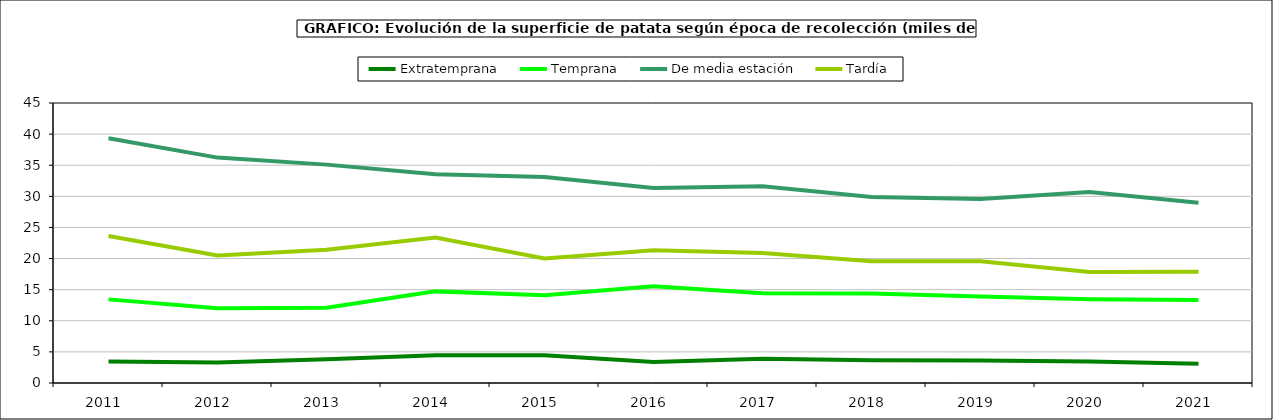
| Category | Extratemprana | Temprana | De media estación | Tardía |
|---|---|---|---|---|
| 2011.0 | 3.471 | 13.439 | 39.332 | 23.623 |
| 2012.0 | 3.309 | 12.004 | 36.224 | 20.486 |
| 2013.0 | 3.821 | 12.091 | 35.096 | 21.424 |
| 2014.0 | 4.468 | 14.725 | 33.547 | 23.388 |
| 2015.0 | 4.465 | 14.085 | 33.109 | 20.017 |
| 2016.0 | 3.373 | 15.55 | 31.323 | 21.344 |
| 2017.0 | 3.917 | 14.433 | 31.633 | 20.895 |
| 2018.0 | 3.647 | 14.386 | 29.899 | 19.556 |
| 2019.0 | 3.597 | 13.907 | 29.563 | 19.583 |
| 2020.0 | 3.44 | 13.449 | 30.682 | 17.833 |
| 2021.0 | 3.087 | 13.339 | 28.962 | 17.895 |